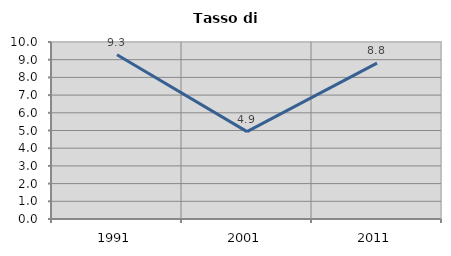
| Category | Tasso di disoccupazione   |
|---|---|
| 1991.0 | 9.282 |
| 2001.0 | 4.935 |
| 2011.0 | 8.81 |